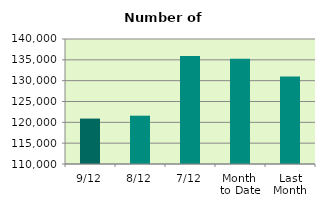
| Category | Series 0 |
|---|---|
| 9/12 | 120898 |
| 8/12 | 121594 |
| 7/12 | 135894 |
| Month 
to Date | 135233.429 |
| Last
Month | 131016.636 |